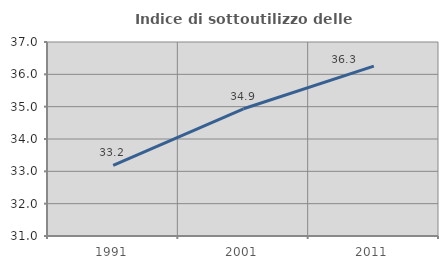
| Category | Indice di sottoutilizzo delle abitazioni  |
|---|---|
| 1991.0 | 33.183 |
| 2001.0 | 34.935 |
| 2011.0 | 36.253 |